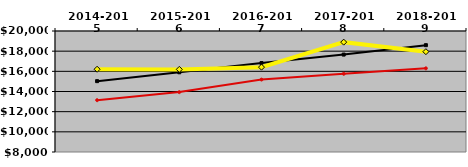
| Category | NATIONAL MEDIAN | WEST MEDIAN | TEXAS LUTHERAN |
|---|---|---|---|
| 2014-2015 | 15026.5 | 13140 | 16208 |
| 2015-2016 | 15904.5 | 13939.5 | 16193 |
| 2016-2017 | 16820.5 | 15181 | 16415 |
| 2017-2018 | 17661 | 15753.5 | 18895 |
| 2018-2019 | 18596 | 16296 | 17949 |